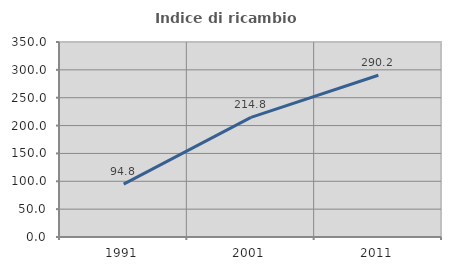
| Category | Indice di ricambio occupazionale  |
|---|---|
| 1991.0 | 94.828 |
| 2001.0 | 214.815 |
| 2011.0 | 290.244 |